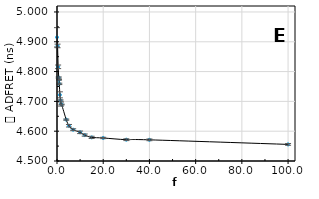
| Category | tADFRET |
|---|---|
| 0.0 | 4.915 |
| 0.25 | 4.886 |
| 0.5 | 4.816 |
| 0.75 | 4.78 |
| 0.875 | 4.772 |
| 1.0 | 4.759 |
| 1.25 | 4.722 |
| 1.5 | 4.703 |
| 1.75 | 4.691 |
| 2.0 | 4.69 |
| 4.0 | 4.639 |
| 5.18 | 4.618 |
| 7.0 | 4.605 |
| 10.0 | 4.596 |
| 12.0 | 4.587 |
| 15.0 | 4.579 |
| 20.0 | 4.577 |
| 30.0 | 4.572 |
| 40.0 | 4.571 |
| 100.0 | 4.556 |